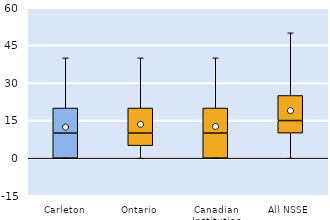
| Category | 25th | 50th | 75th |
|---|---|---|---|
| Carleton | 0 | 10 | 10 |
| Ontario | 5 | 5 | 10 |
| Canadian Institution | 0 | 10 | 10 |
| All NSSE | 10 | 5 | 10 |